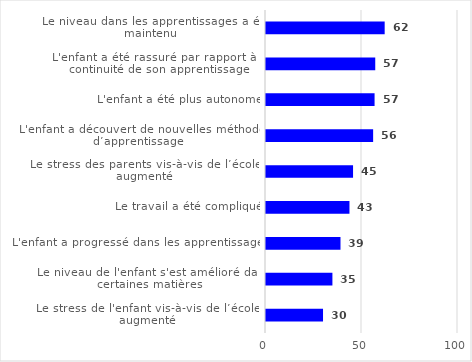
| Category | Series 0 |
|---|---|
| Le niveau dans les apprentissages a été maintenu | 61.81 |
| L'enfant a été rassuré par rapport à la continuité de son apprentissage | 56.9 |
| L'enfant a été plus autonome | 56.55 |
| L'enfant a découvert de nouvelles méthodes d’apprentissage  | 55.8 |
| Le stress des parents vis-à-vis de l’école a augmenté | 45.34 |
| Le travail a été compliqué | 43.47 |
| L'enfant a progressé dans les apprentissages | 38.8 |
| Le niveau de l'enfant s'est amélioré dans certaines matières | 34.59 |
| Le stress de l'enfant vis-à-vis de l’école a augmenté | 29.7 |